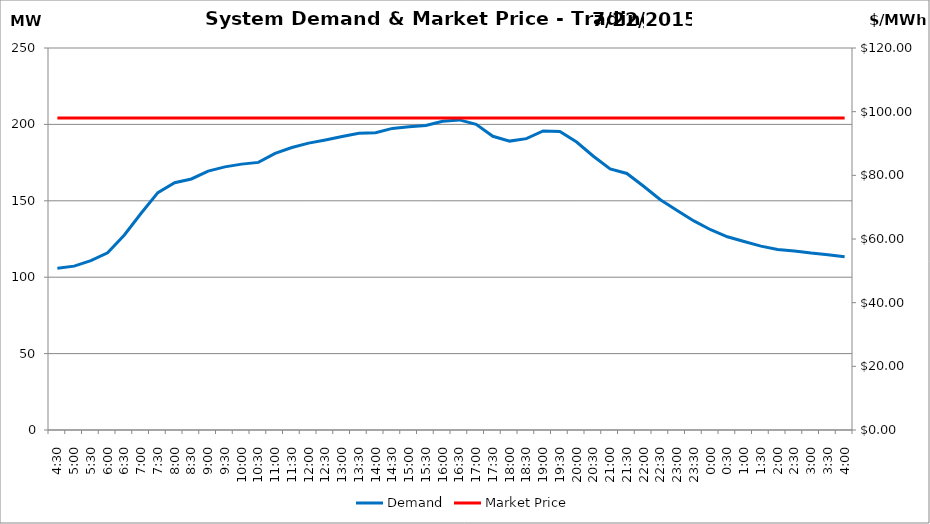
| Category | Demand |
|---|---|
| 0.1875 | 105.83 |
| 0.20833333333333334 | 107.25 |
| 0.22916666666666666 | 110.86 |
| 0.25 | 115.96 |
| 0.270833333333333 | 127.62 |
| 0.291666666666667 | 141.84 |
| 0.3125 | 155.37 |
| 0.333333333333333 | 161.83 |
| 0.354166666666667 | 164.28 |
| 0.375 | 169.47 |
| 0.395833333333333 | 172.2 |
| 0.416666666666667 | 174.01 |
| 0.4375 | 175.13 |
| 0.458333333333333 | 181.03 |
| 0.479166666666667 | 184.9 |
| 0.5 | 187.76 |
| 0.520833333333333 | 189.83 |
| 0.541666666666667 | 192.12 |
| 0.5625 | 194.17 |
| 0.583333333333333 | 194.57 |
| 0.604166666666667 | 197.37 |
| 0.625 | 198.4 |
| 0.645833333333334 | 199.33 |
| 0.666666666666667 | 202.06 |
| 0.6875 | 202.93 |
| 0.708333333333334 | 200.06 |
| 0.729166666666667 | 192.21 |
| 0.75 | 189.07 |
| 0.770833333333334 | 190.7 |
| 0.791666666666667 | 195.68 |
| 0.8125 | 195.3 |
| 0.833333333333334 | 188.46 |
| 0.854166666666667 | 179.17 |
| 0.875 | 170.83 |
| 0.895833333333334 | 167.88 |
| 0.916666666666667 | 159.54 |
| 0.9375 | 150.72 |
| 0.958333333333334 | 143.67 |
| 0.979166666666667 | 136.84 |
| 1900-01-01 | 131.07 |
| 1900-01-01 00:30:00 | 126.44 |
| 1900-01-01 01:00:00 | 123.34 |
| 1900-01-01 01:30:00 | 120.35 |
| 1900-01-01 02:00:00 | 118.19 |
| 1900-01-01 02:30:00 | 117.22 |
| 1900-01-01 03:00:00 | 115.78 |
| 1900-01-01 03:30:00 | 114.73 |
| 1900-01-01 04:00:00 | 113.43 |